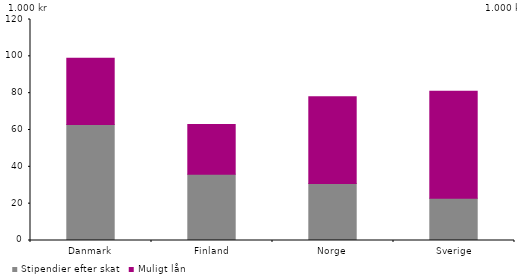
| Category | Stipendier efter skat | Muligt lån |
|---|---|---|
| Danmark | 63 | 36 |
| Finland | 36 | 27 |
| Norge | 31 | 47 |
| Sverige | 23 | 58 |